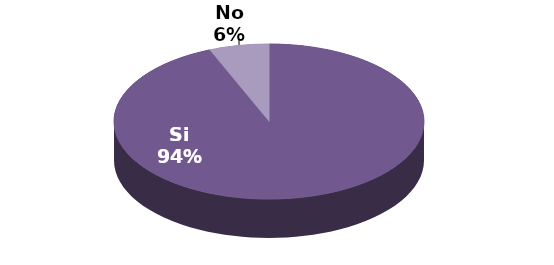
| Category | Series 1 |
|---|---|
| Si | 15 |
| No | 1 |